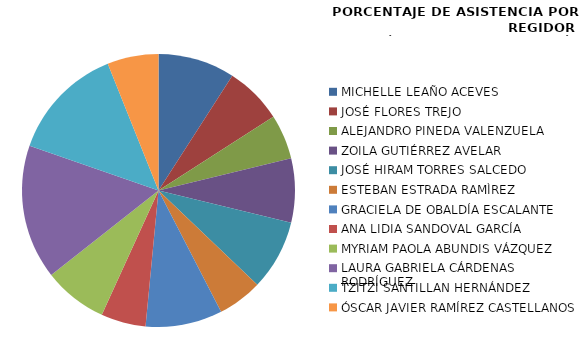
| Category | Series 0 |
|---|---|
| MICHELLE LEAÑO ACEVES | 100 |
| JOSÉ FLORES TREJO | 75 |
| ALEJANDRO PINEDA VALENZUELA | 58.333 |
| ZOILA GUTIÉRREZ AVELAR | 83.333 |
| JOSÉ HIRAM TORRES SALCEDO | 91.667 |
| ESTEBAN ESTRADA RAMÌREZ | 58.333 |
| GRACIELA DE OBALDÍA ESCALANTE | 100 |
| ANA LIDIA SANDOVAL GARCÍA | 58.333 |
| MYRIAM PAOLA ABUNDIS VÁZQUEZ | 83.333 |
| LAURA GABRIELA CÁRDENAS RODRÍGUEZ | 175 |
| TZITZI SANTILLAN HERNÁNDEZ | 150 |
| ÓSCAR JAVIER RAMÍREZ CASTELLANOS | 66.667 |